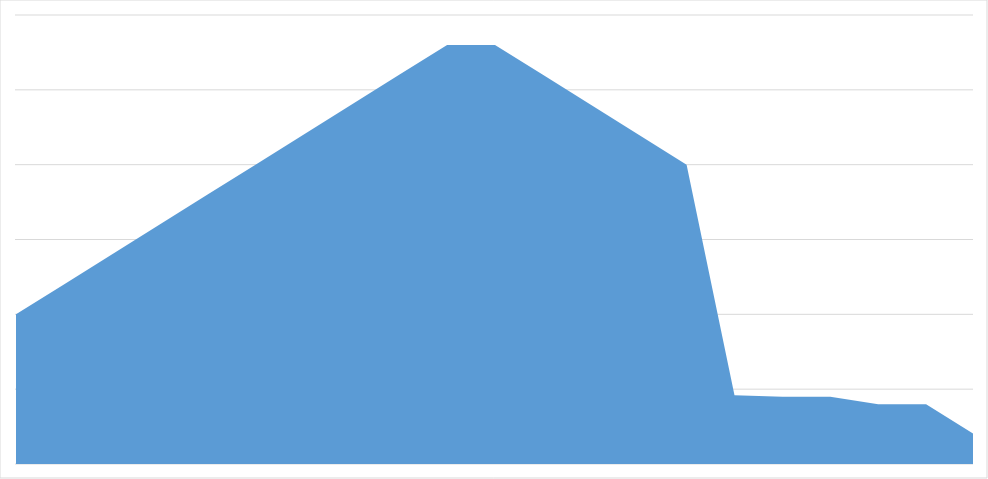
| Category | Series 0 |
|---|---|
| 0 | 1 |
| 1 | 1.2 |
| 2 | 1.4 |
| 3 | 1.6 |
| 4 | 1.8 |
| 5 | 2 |
| 6 | 2.2 |
| 7 | 2.4 |
| 8 | 2.6 |
| 9 | 2.8 |
| 10 | 2.8 |
| 11 | 2.6 |
| 12 | 2.4 |
| 13 | 2.2 |
| 14 | 2 |
| 15 | 0.46 |
| 16 | 0.45 |
| 17 | 0.45 |
| 18 | 0.4 |
| 19 | 0.4 |
| 20 | 0.2 |